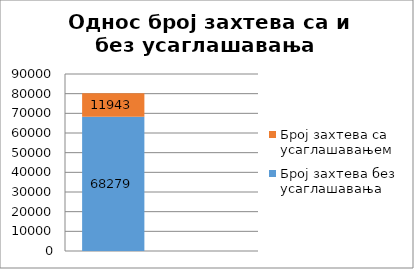
| Category | Број захтева без усаглашавања | Број захтева са усаглашавањем  |
|---|---|---|
| 0 | 68279 | 11943 |
| 1 | 0.851 | 0.149 |